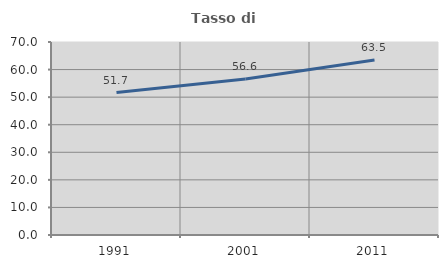
| Category | Tasso di occupazione   |
|---|---|
| 1991.0 | 51.676 |
| 2001.0 | 56.592 |
| 2011.0 | 63.5 |